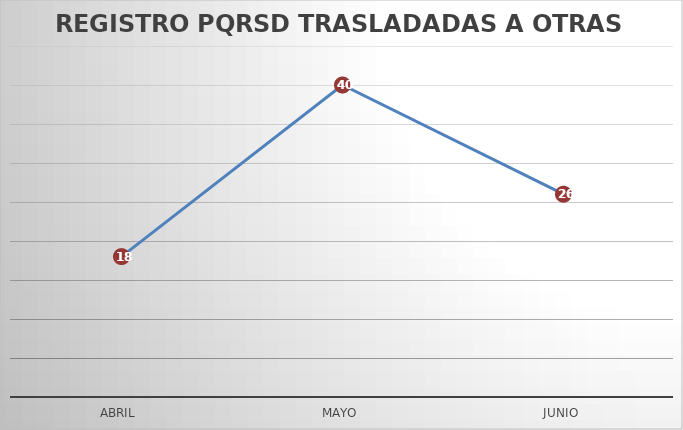
| Category | Series 0 |
|---|---|
| ABRIL | 18 |
| MAYO | 40 |
| JUNIO | 26 |